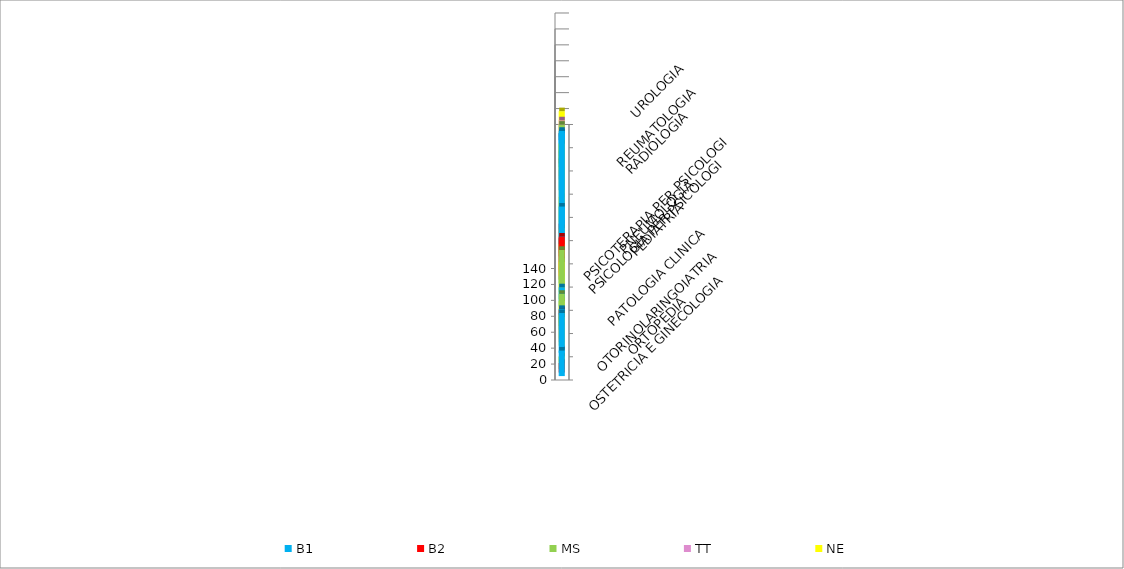
| Category | B1 | B2 | MS | TT | NE |
|---|---|---|---|---|---|
| ORTOPEDIA | 32 | 12 | 16 | 0 | 6 |
| OSTETRICIA E GINECOLOGIA | 50 | 0 | 36 | 21 | 30 |
| OTORINOLARINGOIATRIA | 26 | 20 | 36 | 12 | 18 |
| PATOLOGIA CLINICA | 24 | 0 | 62 | 0 | 38 |
| PEDIATRIA | 9 | 54 | 20 | 6 | 31 |
| PNEUMOLOGIA | 67 | 23 | 31 | 24 | 8 |
| PSICOLOGIA PER PSICOLOGI | 133 | 12 | 108 | 0 | 32 |
| PSICOTERAPIA PER PSICOLOGI | 0 | 0 | 0 | 0 | 0 |
| RADIOLOGIA | 72 | 0 | 0 | 12 | 40 |
| REUMATOLOGIA | 12 | 6 | 12 | 6 | 12 |
| UROLOGIA | 13 | 9 | 15 | 16 | 23 |